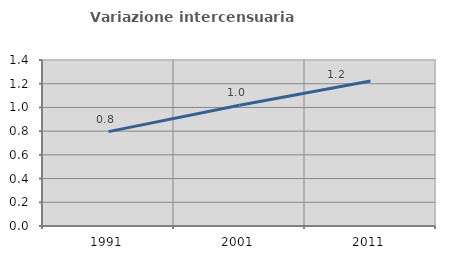
| Category | Variazione intercensuaria annua |
|---|---|
| 1991.0 | 0.796 |
| 2001.0 | 1.018 |
| 2011.0 | 1.222 |